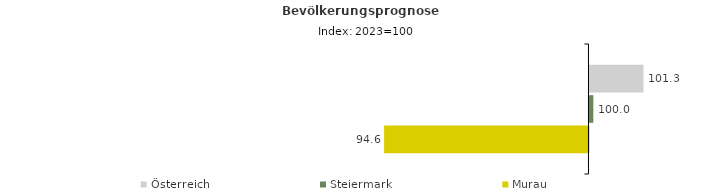
| Category | Österreich | Steiermark | Murau |
|---|---|---|---|
| 2023.0 | 101.3 | 100 | 94.6 |